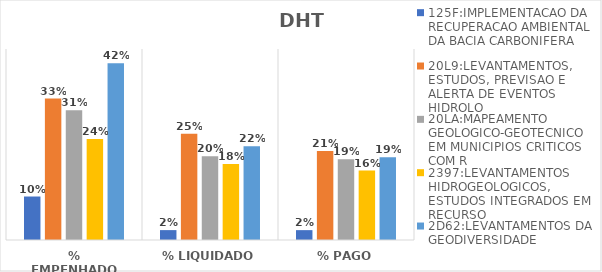
| Category | 125F:IMPLEMENTACAO DA RECUPERACAO AMBIENTAL DA BACIA CARBONIFERA | 20L9:LEVANTAMENTOS, ESTUDOS, PREVISAO E ALERTA DE EVENTOS HIDROLO | 20LA:MAPEAMENTO GEOLOGICO-GEOTECNICO EM MUNICIPIOS CRITICOS COM R | 2397:LEVANTAMENTOS HIDROGEOLOGICOS, ESTUDOS INTEGRADOS EM RECURSO | 2D62:LEVANTAMENTOS DA GEODIVERSIDADE |
|---|---|---|---|---|---|
| % EMPENHADO | 0.102 | 0.333 | 0.306 | 0.238 | 0.417 |
| % LIQUIDADO | 0.023 | 0.25 | 0.197 | 0.179 | 0.221 |
| % PAGO | 0.023 | 0.209 | 0.19 | 0.164 | 0.195 |